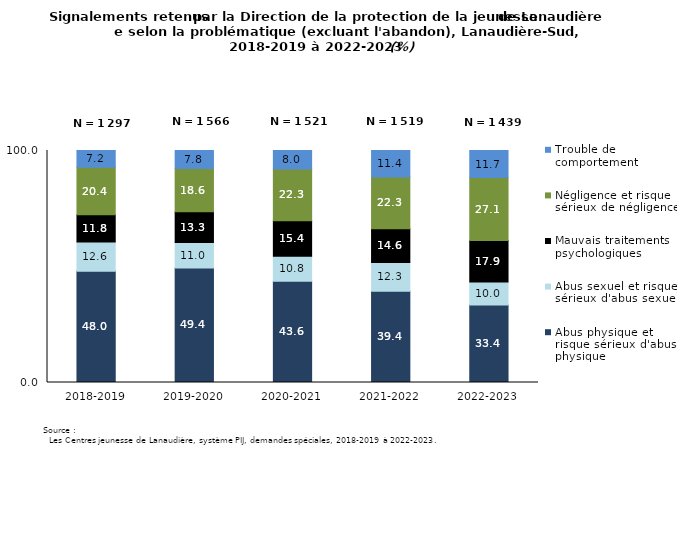
| Category | Abus physique et risque sérieux d'abus physique | Abus sexuel et risque sérieux d'abus sexuel | Mauvais traitements psychologiques | Négligence et risque sérieux de négligence | Trouble de comportement |
|---|---|---|---|---|---|
| 2018-2019 | 47.957 | 12.567 | 11.796 | 20.432 | 7.247 |
| 2019-2020 | 49.361 | 10.983 | 13.282 | 18.582 | 7.791 |
| 2020-2021 | 43.59 | 10.782 | 15.385 | 22.288 | 7.955 |
| 2021-2022 | 39.368 | 12.311 | 14.615 | 22.317 | 11.389 |
| 2022-2023 | 33.356 | 10.007 | 17.86 | 27.102 | 11.675 |